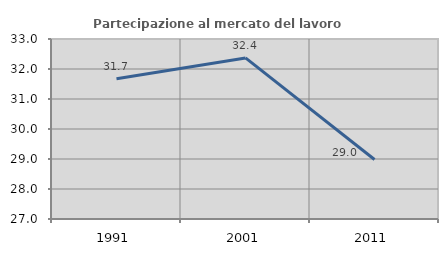
| Category | Partecipazione al mercato del lavoro  femminile |
|---|---|
| 1991.0 | 31.672 |
| 2001.0 | 32.37 |
| 2011.0 | 28.983 |